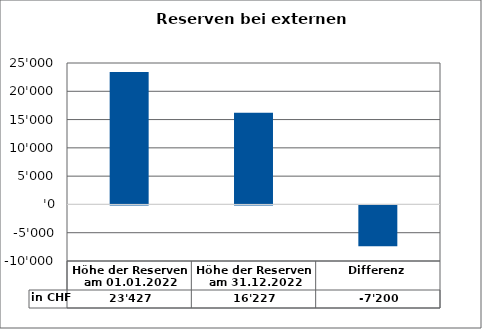
| Category | in CHF |
|---|---|
| Höhe der Reserven am 01.01.2022 | 23427 |
| Höhe der Reserven am 31.12.2022 | 16227 |
| Differenz | -7200 |